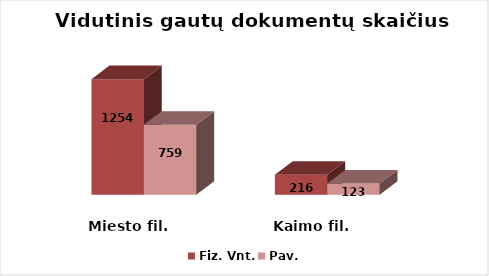
| Category | Fiz. Vnt. | Pav. |
|---|---|---|
| Miesto fil. | 1254 | 759 |
| Kaimo fil. | 216 | 123 |